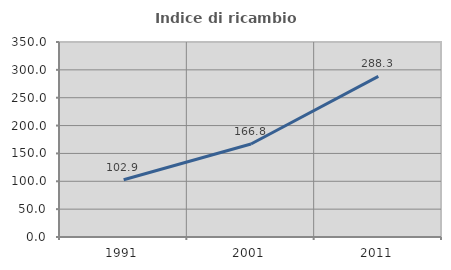
| Category | Indice di ricambio occupazionale  |
|---|---|
| 1991.0 | 102.862 |
| 2001.0 | 166.837 |
| 2011.0 | 288.28 |